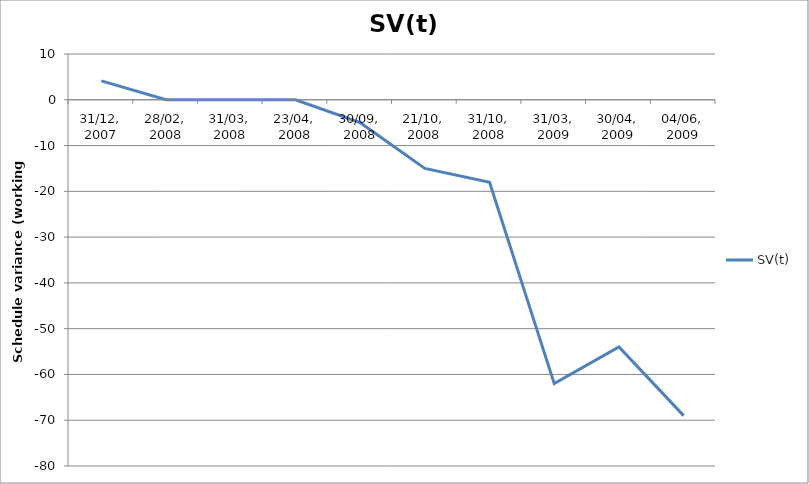
| Category | SV(t) |
|---|---|
| 31/12, 2007 | 4.125 |
| 28/02, 2008 | 0 |
| 31/03, 2008 | 0 |
| 23/04, 2008 | 0 |
| 30/09, 2008 | -5 |
| 21/10, 2008 | -15 |
| 31/10, 2008 | -18 |
| 31/03, 2009 | -62 |
| 30/04, 2009 | -54 |
| 04/06, 2009 | -69 |